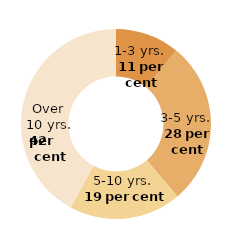
| Category | Series 0 |
|---|---|
| 1-3 years | 73.024 |
| 3-5 years | 186.056 |
| 5-10 years | 127.443 |
| Over 10 years | 281.111 |